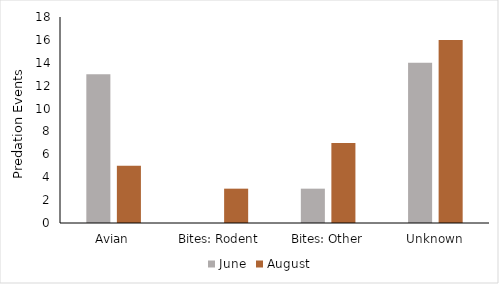
| Category | June | August |
|---|---|---|
| Avian | 13 | 5 |
| Bites: Rodent | 0 | 3 |
| Bites: Other | 3 | 7 |
| Unknown | 14 | 16 |